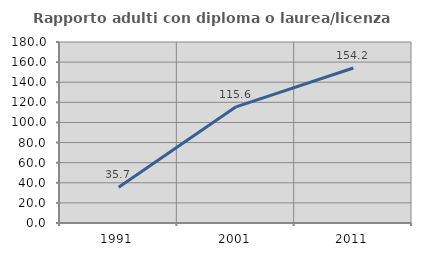
| Category | Rapporto adulti con diploma o laurea/licenza media  |
|---|---|
| 1991.0 | 35.652 |
| 2001.0 | 115.556 |
| 2011.0 | 154.167 |